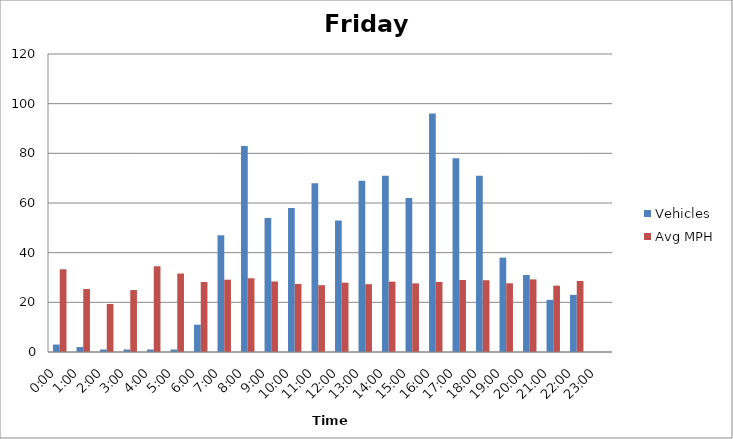
| Category | Vehicles | Avg MPH |
|---|---|---|
| 0:00 | 3 | 33.31 |
| 1:00 | 2 | 25.37 |
| 2:00 | 1 | 19.35 |
| 3:00 | 1 | 24.95 |
| 4:00 | 1 | 34.53 |
| 5:00 | 1 | 31.6 |
| 6:00 | 11 | 28.21 |
| 7:00 | 47 | 29.12 |
| 8:00 | 83 | 29.69 |
| 9:00 | 54 | 28.4 |
| 10:00 | 58 | 27.43 |
| 11:00 | 68 | 26.9 |
| 12:00 | 53 | 27.91 |
| 13:00 | 69 | 27.33 |
| 14:00 | 71 | 28.33 |
| 15:00 | 62 | 27.64 |
| 16:00 | 96 | 28.2 |
| 17:00 | 78 | 28.99 |
| 18:00 | 71 | 28.9 |
| 19:00 | 38 | 27.68 |
| 20:00 | 31 | 29.25 |
| 21:00 | 21 | 26.72 |
| 22:00 | 23 | 28.61 |
| 23:00 | 0 | 0 |